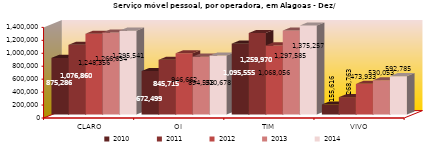
| Category | 2010 | 2011 | 2012 | 2013 | 2014 |
|---|---|---|---|---|---|
| CLARO | 875286 | 1076860 | 1248356 | 1266634 | 1295541 |
| OI | 672499 | 845715 | 946662 | 894558 | 910678 |
| TIM | 1095555 | 1259970 | 1068056 | 1297585 | 1375257 |
| VIVO | 155616 | 268763 | 473933 | 530053 | 592785 |